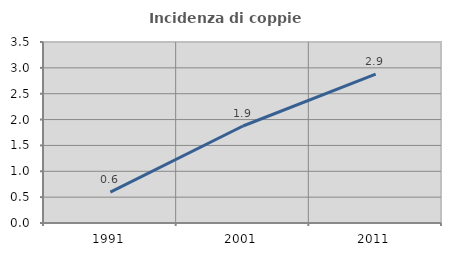
| Category | Incidenza di coppie miste |
|---|---|
| 1991.0 | 0.598 |
| 2001.0 | 1.876 |
| 2011.0 | 2.878 |